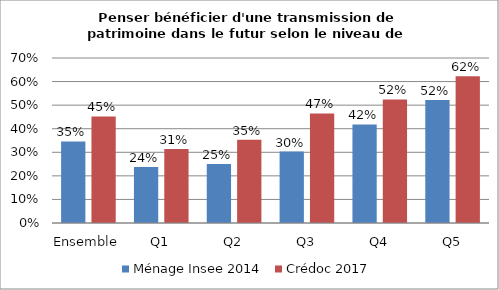
| Category | Ménage Insee 2014 | Crédoc 2017 |
|---|---|---|
| Ensemble | 0.346 | 0.452 |
| Q1 | 0.238 | 0.314 |
| Q2 | 0.25 | 0.353 |
| Q3 | 0.303 | 0.465 |
| Q4 | 0.418 | 0.524 |
| Q5 | 0.522 | 0.623 |